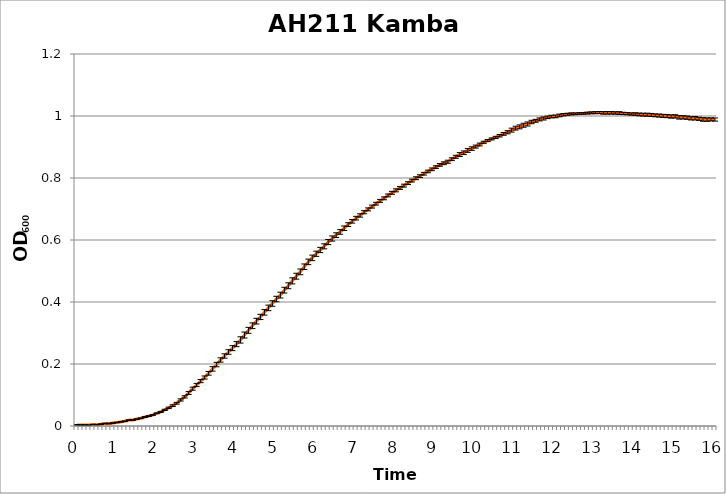
| Category | Series 0 |
|---|---|
| 0.0 | 0.004 |
| nan | 0.003 |
| nan | 0.003 |
| nan | 0.003 |
| nan | 0.005 |
| nan | 0.004 |
| nan | 0.006 |
| nan | 0.008 |
| nan | 0.008 |
| nan | 0.01 |
| 1.0 | 0.011 |
| nan | 0.013 |
| nan | 0.015 |
| nan | 0.019 |
| nan | 0.019 |
| nan | 0.022 |
| nan | 0.025 |
| nan | 0.029 |
| nan | 0.032 |
| nan | 0.035 |
| 2.0 | 0.041 |
| nan | 0.045 |
| nan | 0.052 |
| nan | 0.059 |
| nan | 0.066 |
| nan | 0.073 |
| nan | 0.084 |
| nan | 0.094 |
| nan | 0.106 |
| nan | 0.12 |
| 3.0 | 0.132 |
| nan | 0.145 |
| nan | 0.156 |
| nan | 0.17 |
| nan | 0.184 |
| nan | 0.198 |
| nan | 0.213 |
| nan | 0.226 |
| nan | 0.239 |
| nan | 0.251 |
| 4.0 | 0.264 |
| nan | 0.278 |
| nan | 0.293 |
| nan | 0.309 |
| nan | 0.323 |
| nan | 0.338 |
| nan | 0.352 |
| nan | 0.367 |
| nan | 0.381 |
| nan | 0.395 |
| 5.0 | 0.41 |
| nan | 0.422 |
| nan | 0.438 |
| nan | 0.452 |
| nan | 0.468 |
| nan | 0.483 |
| nan | 0.497 |
| nan | 0.514 |
| nan | 0.529 |
| nan | 0.542 |
| 6.0 | 0.556 |
| nan | 0.568 |
| nan | 0.58 |
| nan | 0.593 |
| nan | 0.605 |
| nan | 0.616 |
| nan | 0.626 |
| nan | 0.638 |
| nan | 0.65 |
| nan | 0.66 |
| 7.0 | 0.67 |
| nan | 0.679 |
| nan | 0.69 |
| nan | 0.699 |
| nan | 0.708 |
| nan | 0.717 |
| nan | 0.726 |
| nan | 0.734 |
| nan | 0.744 |
| nan | 0.752 |
| 8.0 | 0.76 |
| nan | 0.768 |
| nan | 0.775 |
| nan | 0.783 |
| nan | 0.792 |
| nan | 0.799 |
| nan | 0.806 |
| nan | 0.814 |
| nan | 0.821 |
| nan | 0.828 |
| 9.0 | 0.835 |
| nan | 0.842 |
| nan | 0.848 |
| nan | 0.852 |
| nan | 0.861 |
| nan | 0.868 |
| nan | 0.876 |
| nan | 0.881 |
| nan | 0.889 |
| nan | 0.895 |
| 10.0 | 0.901 |
| nan | 0.908 |
| nan | 0.915 |
| nan | 0.921 |
| nan | 0.926 |
| nan | 0.931 |
| nan | 0.936 |
| nan | 0.942 |
| nan | 0.948 |
| nan | 0.954 |
| 11.0 | 0.961 |
| nan | 0.965 |
| nan | 0.97 |
| nan | 0.974 |
| nan | 0.981 |
| nan | 0.984 |
| nan | 0.989 |
| nan | 0.992 |
| nan | 0.996 |
| nan | 0.998 |
| 12.0 | 0.999 |
| nan | 1.002 |
| nan | 1.004 |
| nan | 1.006 |
| nan | 1.007 |
| nan | 1.007 |
| nan | 1.008 |
| nan | 1.008 |
| nan | 1.009 |
| nan | 1.01 |
| 13.0 | 1.011 |
| nan | 1.011 |
| nan | 1.01 |
| nan | 1.01 |
| nan | 1.01 |
| nan | 1.01 |
| nan | 1.009 |
| nan | 1.008 |
| nan | 1.008 |
| nan | 1.006 |
| 14.0 | 1.006 |
| nan | 1.005 |
| nan | 1.004 |
| nan | 1.004 |
| nan | 1.003 |
| nan | 1.002 |
| nan | 1.001 |
| nan | 1 |
| nan | 1 |
| nan | 0.998 |
| 15.0 | 0.999 |
| nan | 0.996 |
| nan | 0.996 |
| nan | 0.995 |
| nan | 0.992 |
| nan | 0.993 |
| nan | 0.991 |
| nan | 0.989 |
| nan | 0.988 |
| nan | 0.989 |
| 16.0 | 0.989 |